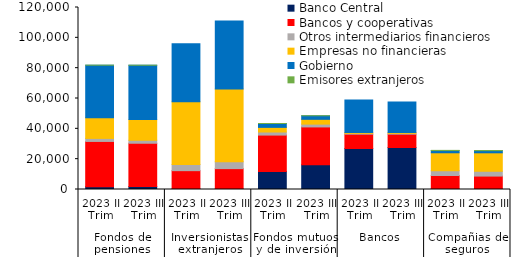
| Category | Banco Central | Bancos y cooperativas | Otros intermediarios financieros | Empresas no financieras | Gobierno  | Emisores extranjeros |
|---|---|---|---|---|---|---|
| 0 | 1876.175 | 29812.881 | 1997.356 | 13682.301 | 34586.761 | 36.089 |
| 1 | 1940.175 | 28553.989 | 1955.616 | 13635.096 | 35833.401 | 36.198 |
| 2 | 375.182 | 12045.857 | 4080.65 | 41273.556 | 38359.166 | 0 |
| 3 | 343.825 | 13423.494 | 4596.555 | 47833.67 | 44868.285 | 0 |
| 4 | 11830.571 | 24051.233 | 2024.842 | 3058.508 | 2552.397 | 0.18 |
| 5 | 16321.142 | 24932.433 | 1847.227 | 3168.372 | 2353.88 | 0.181 |
| 6 | 27039.733 | 9447.593 | 533.391 | 537.165 | 21535.472 | 0 |
| 7 | 27675.779 | 8819.952 | 520.524 | 543.149 | 20109.229 | 0 |
| 8 | 344.651 | 8868.145 | 3156.75 | 11841.948 | 1453.696 | 124.545 |
| 9 | 290.977 | 8555.988 | 3170.892 | 12173.633 | 1416.652 | 124.918 |